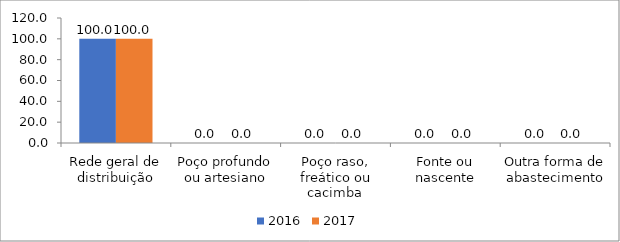
| Category | 2016 | 2017 |
|---|---|---|
| Rede geral de distribuição | 100 | 100 |
| Poço profundo ou artesiano | 0 | 0 |
| Poço raso, freático ou cacimba | 0 | 0 |
| Fonte ou nascente | 0 | 0 |
| Outra forma de abastecimento | 0 | 0 |